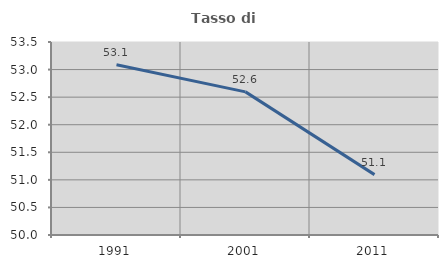
| Category | Tasso di occupazione   |
|---|---|
| 1991.0 | 53.086 |
| 2001.0 | 52.596 |
| 2011.0 | 51.095 |